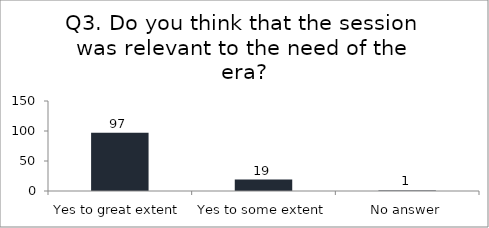
| Category | Q3. Do you think that the session was relevant to the need of the era? |
|---|---|
| Yes to great extent | 97 |
| Yes to some extent | 19 |
| No answer | 1 |